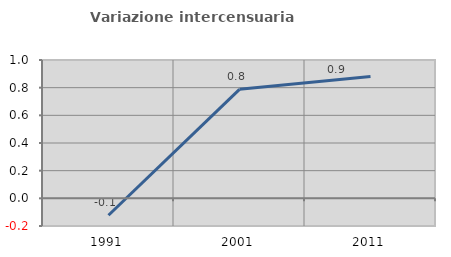
| Category | Variazione intercensuaria annua |
|---|---|
| 1991.0 | -0.123 |
| 2001.0 | 0.788 |
| 2011.0 | 0.881 |